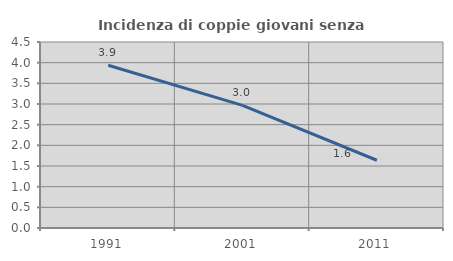
| Category | Incidenza di coppie giovani senza figli |
|---|---|
| 1991.0 | 3.937 |
| 2001.0 | 2.967 |
| 2011.0 | 1.639 |